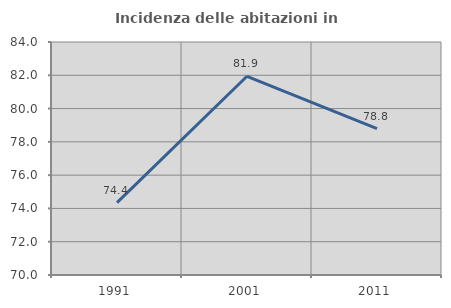
| Category | Incidenza delle abitazioni in proprietà  |
|---|---|
| 1991.0 | 74.352 |
| 2001.0 | 81.941 |
| 2011.0 | 78.797 |